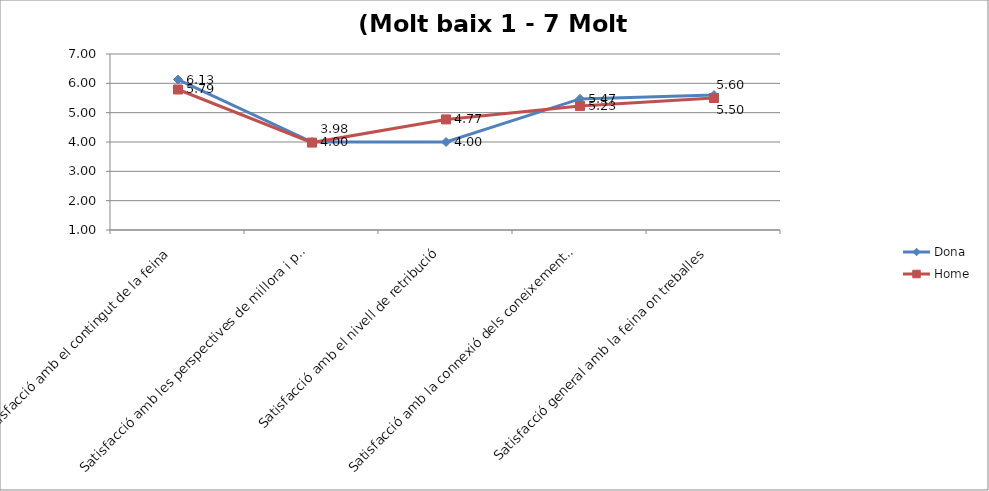
| Category | Dona | Home |
|---|---|---|
| Satisfacció amb el contingut de la feina | 6.13 | 5.79 |
| Satisfacció amb les perspectives de millora i promoció | 4 | 3.98 |
| Satisfacció amb el nivell de retribució | 4 | 4.77 |
| Satisfacció amb la connexió dels coneixements/competències desenvolupades de la formació doctoral i la feina | 5.47 | 5.23 |
| Satisfacció general amb la feina on treballes | 5.6 | 5.5 |